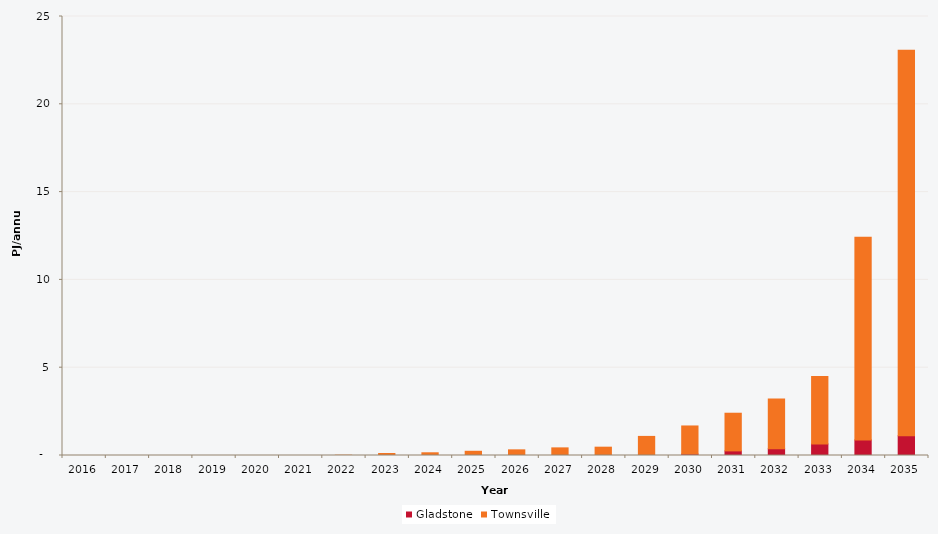
| Category | Gladstone | Townsville |
|---|---|---|
| 2016.0 | 0 | 0 |
| 2017.0 | 0 | 0 |
| 2018.0 | 0 | 0 |
| 2019.0 | 0 | 0 |
| 2020.0 | 0 | 0 |
| 2021.0 | 0 | 0 |
| 2022.0 | 0 | 0.017 |
| 2023.0 | 0 | 0.113 |
| 2024.0 | 0 | 0.155 |
| 2025.0 | 0 | 0.24 |
| 2026.0 | 0 | 0.322 |
| 2027.0 | 0 | 0.434 |
| 2028.0 | 0.001 | 0.473 |
| 2029.0 | 0.006 | 1.081 |
| 2030.0 | 0.084 | 1.598 |
| 2031.0 | 0.262 | 2.145 |
| 2032.0 | 0.386 | 2.833 |
| 2033.0 | 0.658 | 3.847 |
| 2034.0 | 0.888 | 11.54 |
| 2035.0 | 1.124 | 21.953 |